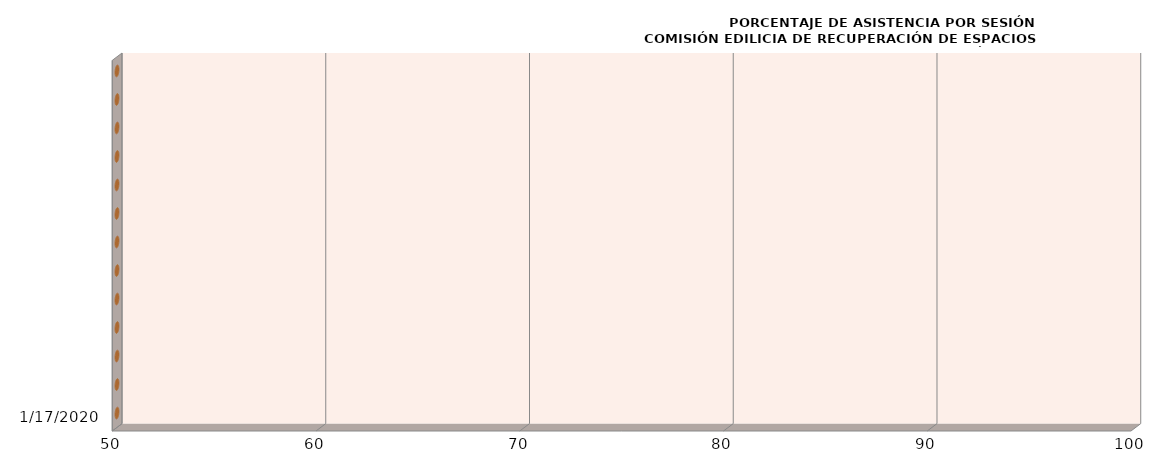
| Category | Series 0 |
|---|---|
| 1/17/20 | 0 |
| nan | 0 |
| nan | 0 |
| nan | 0 |
| nan | 0 |
| nan | 0 |
| nan | 0 |
| nan | 0 |
| nan | 0 |
| nan | 0 |
| nan | 0 |
| nan | 0 |
| nan | 0 |